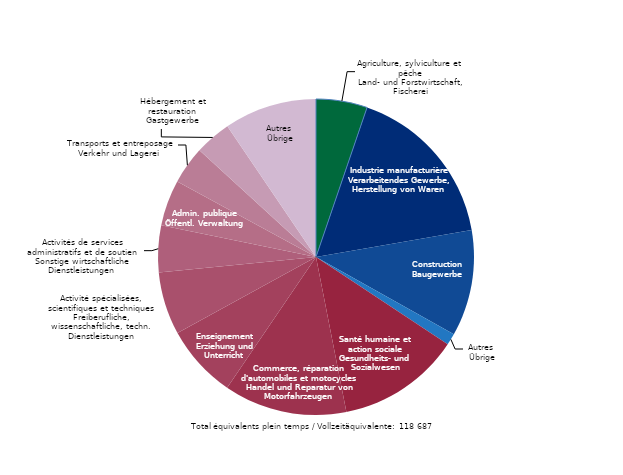
| Category | branches |
|---|---|
| Agriculture, sylviculture et pêche
Land- und Forstwirtschaft, Fischerei | 6216.152 |
| Industrie manufacturière
Verarbeitendes Gewerbe, Herstellung von Waren  | 20210.7 |
| Construction
Baugewerbe | 12891.349 |
| Autres 
Übrige | 1413.676 |
| Santé humaine et 
action sociale
Gesundheits- und 
Sozialwesen | 14952.686 |
| Commerce, réparation d'automobiles et motocycles
Handel und Reparatur von Motorfahrzeugen | 14939.776 |
| Enseignement
Erziehung und
Unterricht | 8905.919 |
| Activité spécialisées, scientifiques et techniques
Freiberufliche, wissenschaftliche, techn. Dienstleistungen | 7629.174 |
| Activités de services administratifs et de soutien 
Sonstige wirtschaftliche Dienstleistungen  | 5687.697 |
| Admin. publique
Öffentl. Verwaltung | 5586.345 |
| Transports et entreposage
Verkehr und Lagerei  | 4579.144 |
| Hébergement et restauration
Gastgewerbe | 4424.186 |
| Autres 
Übrige | 11250.273 |